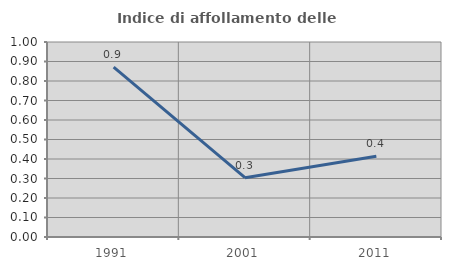
| Category | Indice di affollamento delle abitazioni  |
|---|---|
| 1991.0 | 0.871 |
| 2001.0 | 0.304 |
| 2011.0 | 0.414 |